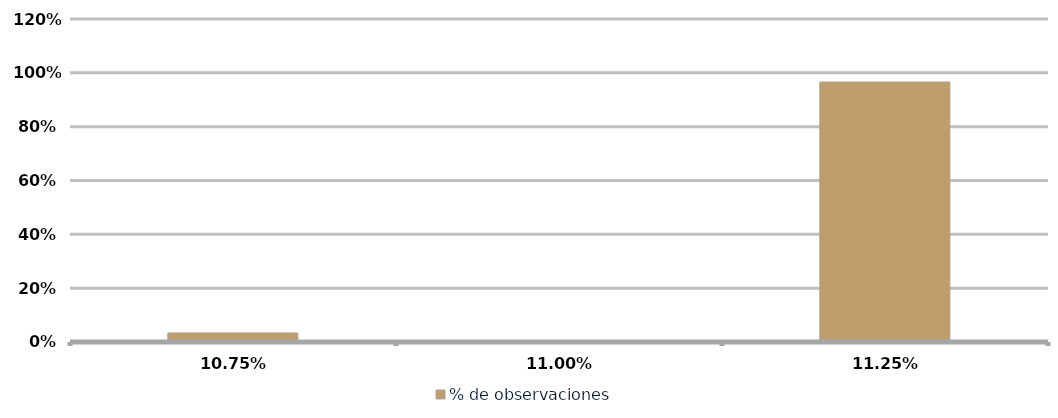
| Category | % de observaciones  |
|---|---|
| 0.1075 | 0.034 |
| 0.11 | 0 |
| 0.1125 | 0.966 |